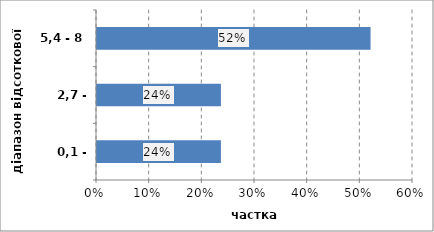
| Category | Series 0 |
|---|---|
| 0,1 - 2,7 | 0.235 |
| 2,7 - 5,4 | 0.235 |
| 5,4 - 8 | 0.519 |